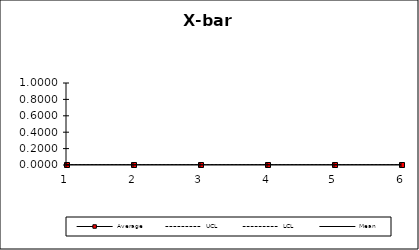
| Category | Average | UCL | LCL | Mean |
|---|---|---|---|---|
| 0 | 0 | 0 | 0 | 0 |
| 1 | 0 | 0 | 0 | 0 |
| 2 | 0 | 0 | 0 | 0 |
| 3 | 0 | 0 | 0 | 0 |
| 4 | 0 | 0 | 0 | 0 |
| 5 | 0 | 0 | 0 | 0 |